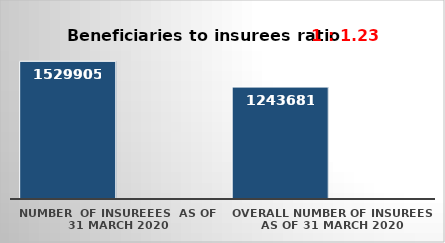
| Category | Series 0 | Series 1 |
|---|---|---|
| NUMBER  of insureees  as of  31 March 2020 | 1529905 |  |
| OVERALL number of insurees as of 31 March 2020 | 1243681 |  |